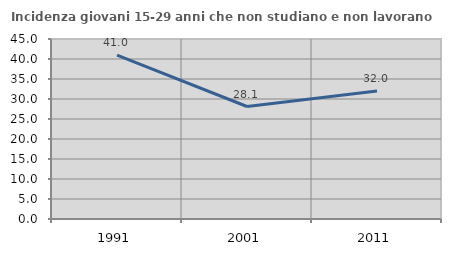
| Category | Incidenza giovani 15-29 anni che non studiano e non lavorano  |
|---|---|
| 1991.0 | 40.985 |
| 2001.0 | 28.125 |
| 2011.0 | 32 |